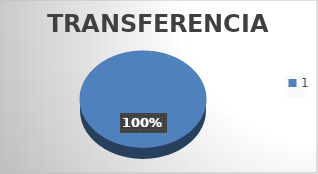
| Category | Transferencias |
|---|---|
| 0 | 5 |